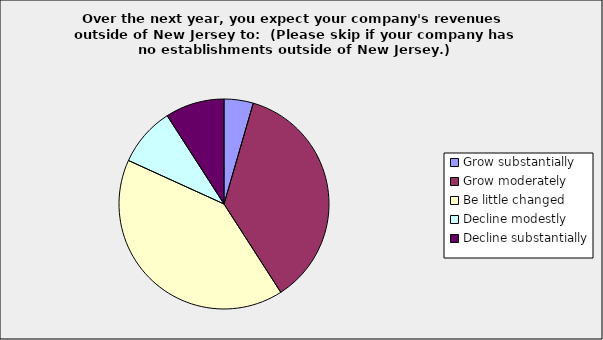
| Category | Series 0 |
|---|---|
| Grow substantially | 0.045 |
| Grow moderately | 0.364 |
| Be little changed | 0.409 |
| Decline modestly | 0.091 |
| Decline substantially | 0.091 |